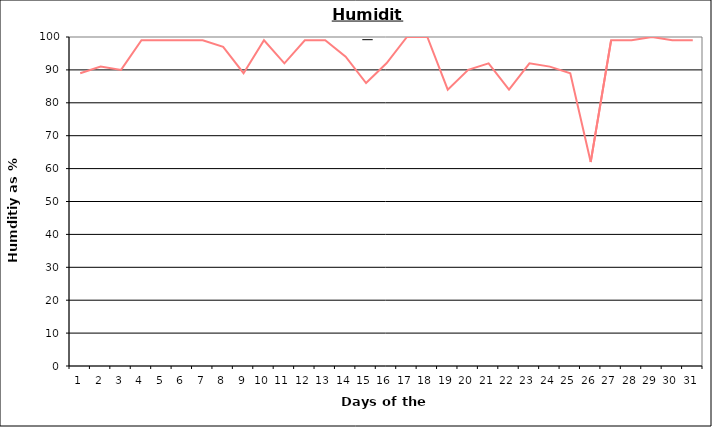
| Category | Series 0 |
|---|---|
| 0 | 89 |
| 1 | 91 |
| 2 | 90 |
| 3 | 99 |
| 4 | 99 |
| 5 | 99 |
| 6 | 99 |
| 7 | 97 |
| 8 | 89 |
| 9 | 99 |
| 10 | 92 |
| 11 | 99 |
| 12 | 99 |
| 13 | 94 |
| 14 | 86 |
| 15 | 92 |
| 16 | 100 |
| 17 | 100 |
| 18 | 84 |
| 19 | 90 |
| 20 | 92 |
| 21 | 84 |
| 22 | 92 |
| 23 | 91 |
| 24 | 89 |
| 25 | 62 |
| 26 | 99 |
| 27 | 99 |
| 28 | 100 |
| 29 | 99 |
| 30 | 99 |